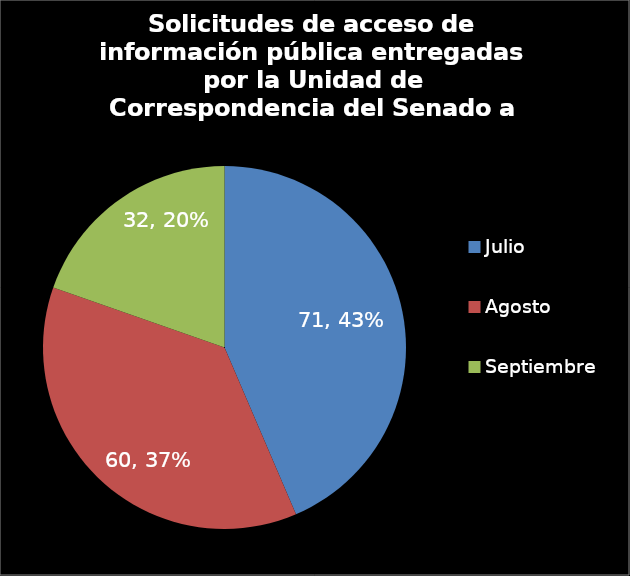
| Category | Series 0 |
|---|---|
| Julio | 71 |
| Agosto | 60 |
| Septiembre | 32 |